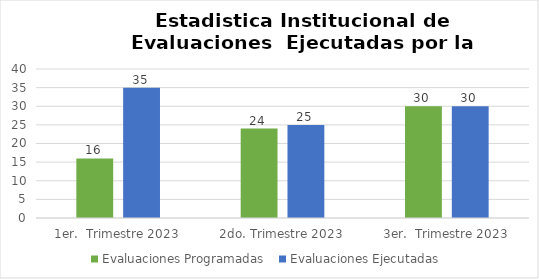
| Category | Evaluaciones Programadas  | Evaluaciones Ejecutadas  |
|---|---|---|
| 1er.  Trimestre 2023 | 16 | 35 |
| 2do. Trimestre 2023 | 24 | 25 |
| 3er.  Trimestre 2023 | 30 | 30 |